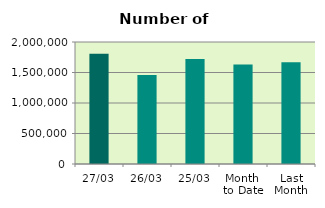
| Category | Series 0 |
|---|---|
| 27/03 | 1808906 |
| 26/03 | 1459676 |
| 25/03 | 1721980 |
| Month 
to Date | 1632549.263 |
| Last
Month | 1666801.1 |